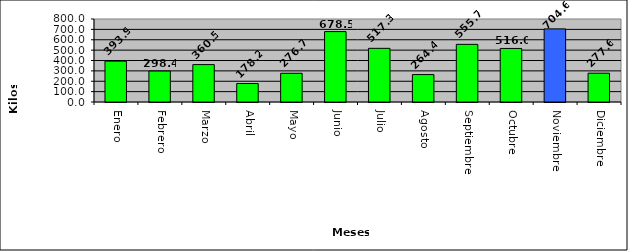
| Category | Mariguana |
|---|---|
| Enero | 393.9 |
| Febrero | 298.4 |
| Marzo | 360.5 |
| Abril | 178.2 |
| Mayo | 276.7 |
| Junio | 678.5 |
| Julio | 517.3 |
| Agosto | 264.4 |
| Septiembre | 555.7 |
| Octubre | 516 |
| Noviembre | 704.6 |
| Diciembre | 277.6 |